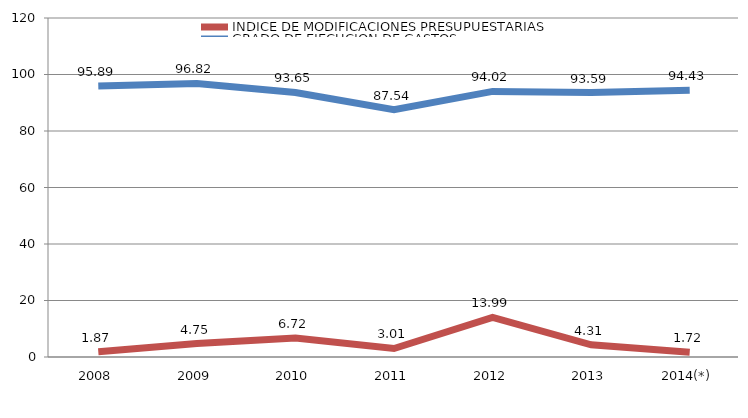
| Category | INDICE DE MODIFICACIONES PRESUPUESTARIAS | GRADO DE EJECUCION DE GASTOS |
|---|---|---|
| 2008 | 1.871 | 95.893 |
| 2009 | 4.747 | 96.817 |
| 2010 | 6.715 | 93.652 |
| 2011 | 3.011 | 87.543 |
| 2012 | 13.991 | 94.017 |
| 2013 | 4.31 | 93.595 |
| 2014(*) | 1.722 | 94.427 |